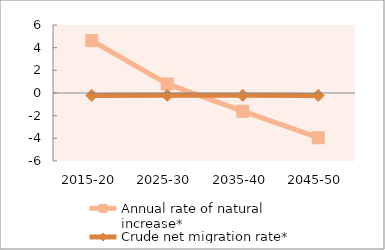
| Category | Annual rate of natural increase* | Crude net migration rate* |
|---|---|---|
| 2015-20 | 4.626 | -0.212 |
| 2025-30 | 0.801 | -0.207 |
| 2035-40 | -1.607 | -0.208 |
| 2045-50 | -3.946 | -0.214 |